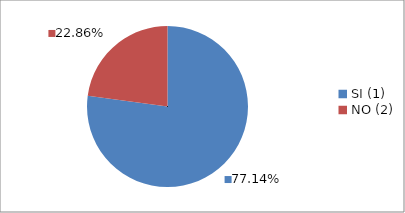
| Category | Series 0 |
|---|---|
| SI (1) | 0.771 |
| NO (2) | 0.229 |